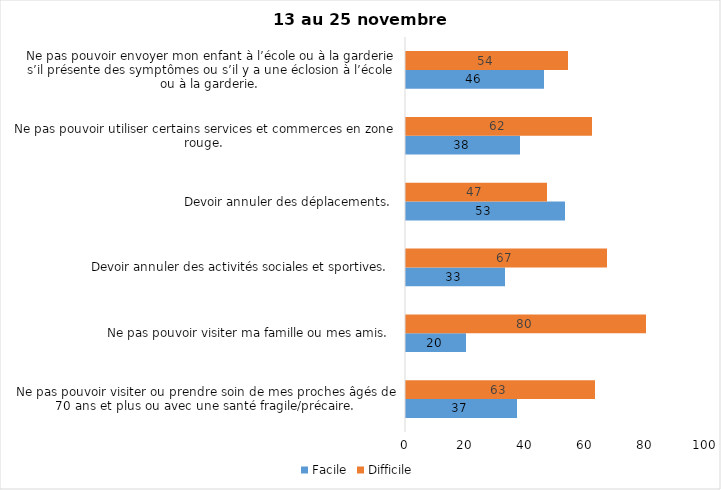
| Category | Facile | Difficile |
|---|---|---|
| Ne pas pouvoir visiter ou prendre soin de mes proches âgés de 70 ans et plus ou avec une santé fragile/précaire.  | 37 | 63 |
| Ne pas pouvoir visiter ma famille ou mes amis.  | 20 | 80 |
| Devoir annuler des activités sociales et sportives.  | 33 | 67 |
| Devoir annuler des déplacements.  | 53 | 47 |
| Ne pas pouvoir utiliser certains services et commerces en zone rouge.  | 38 | 62 |
| Ne pas pouvoir envoyer mon enfant à l’école ou à la garderie s’il présente des symptômes ou s’il y a une éclosion à l’école ou à la garderie.  | 46 | 54 |